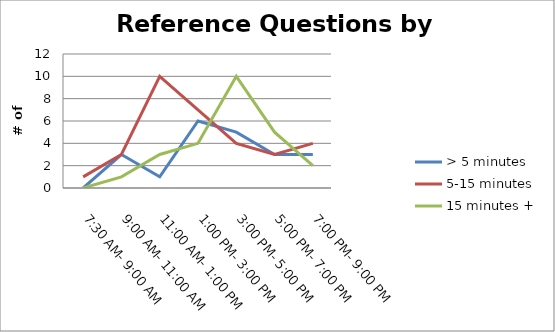
| Category | > 5 minutes | 5-15 minutes | 15 minutes + |
|---|---|---|---|
| 7:30 AM- 9:00 AM | 0 | 1 | 0 |
| 9:00 AM- 11:00 AM | 3 | 3 | 1 |
| 11:00 AM- 1:00 PM | 1 | 10 | 3 |
| 1:00 PM- 3:00 PM | 6 | 7 | 4 |
| 3:00 PM- 5:00 PM | 5 | 4 | 10 |
| 5:00 PM- 7:00 PM | 3 | 3 | 5 |
| 7:00 PM- 9:00 PM | 3 | 4 | 2 |